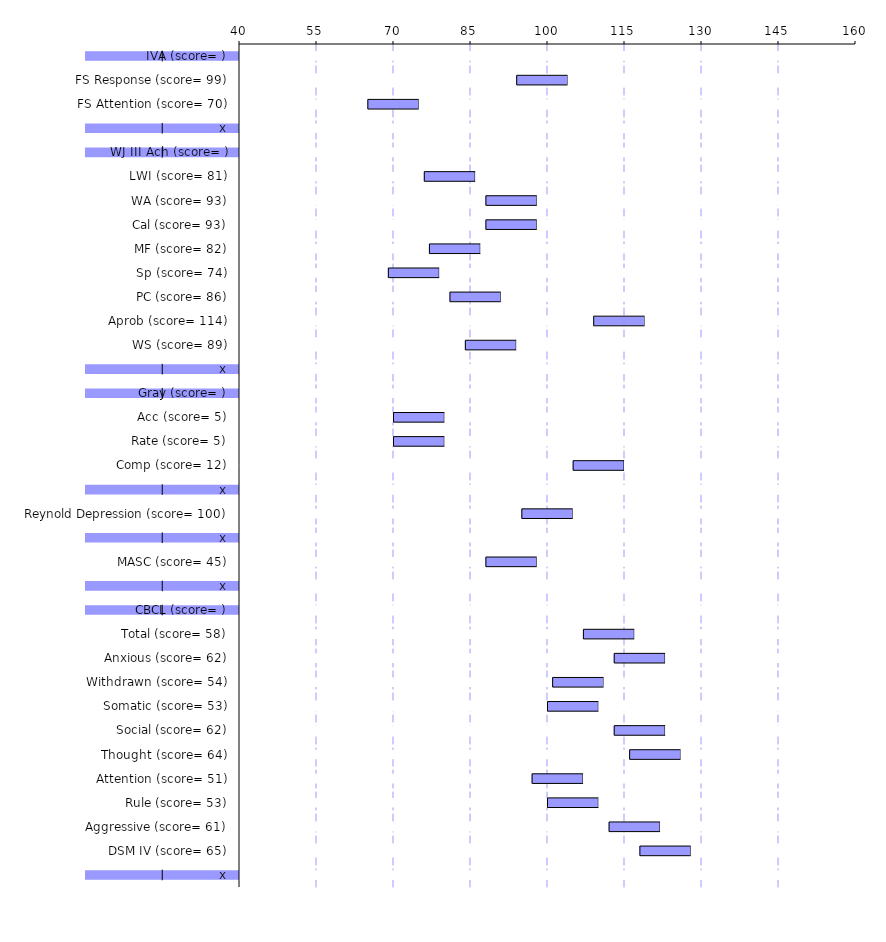
| Category | Series 0 | Series 1 | Series 2 |
|---|---|---|---|
| IVA (score= ) | -5 | 10 | 155 |
| FS Response (score= 99) | 94 | 10 | 56 |
| FS Attention (score= 70) | 65 | 10 | 85 |
| x | -5 | 10 | 155 |
| WJ III Ach (score= ) | -5 | 10 | 155 |
| LWI (score= 81) | 76 | 10 | 74 |
| WA (score= 93) | 88 | 10 | 62 |
| Cal (score= 93) | 88 | 10 | 62 |
| MF (score= 82) | 77 | 10 | 73 |
| Sp (score= 74) | 69 | 10 | 81 |
| PC (score= 86) | 81 | 10 | 69 |
| Aprob (score= 114) | 109 | 10 | 41 |
| WS (score= 89) | 84 | 10 | 66 |
| x | -5 | 10 | 155 |
| Gray (score= ) | -5 | 10 | 155 |
| Acc (score= 5) | 70 | 10 | 80 |
| Rate (score= 5) | 70 | 10 | 80 |
| Comp (score= 12) | 105 | 10 | 45 |
| x | -5 | 10 | 155 |
| Reynold Depression (score= 100) | 95 | 10 | 55 |
| x | -5 | 10 | 155 |
| MASC (score= 45) | 88 | 10 | 62 |
| x | -5 | 10 | 155 |
| CBCL (score= ) | -5 | 10 | 155 |
| Total (score= 58) | 107 | 10 | 43 |
| Anxious (score= 62) | 113 | 10 | 37 |
| Withdrawn (score= 54) | 101 | 10 | 49 |
| Somatic (score= 53) | 100 | 10 | 50 |
| Social (score= 62) | 113 | 10 | 37 |
| Thought (score= 64) | 116 | 10 | 34 |
| Attention (score= 51) | 97 | 10 | 53 |
| Rule (score= 53) | 100 | 10 | 50 |
| Aggressive (score= 61) | 112 | 10 | 38 |
| DSM IV (score= 65) | 118 | 10 | 32 |
| x | -5 | 10 | 155 |